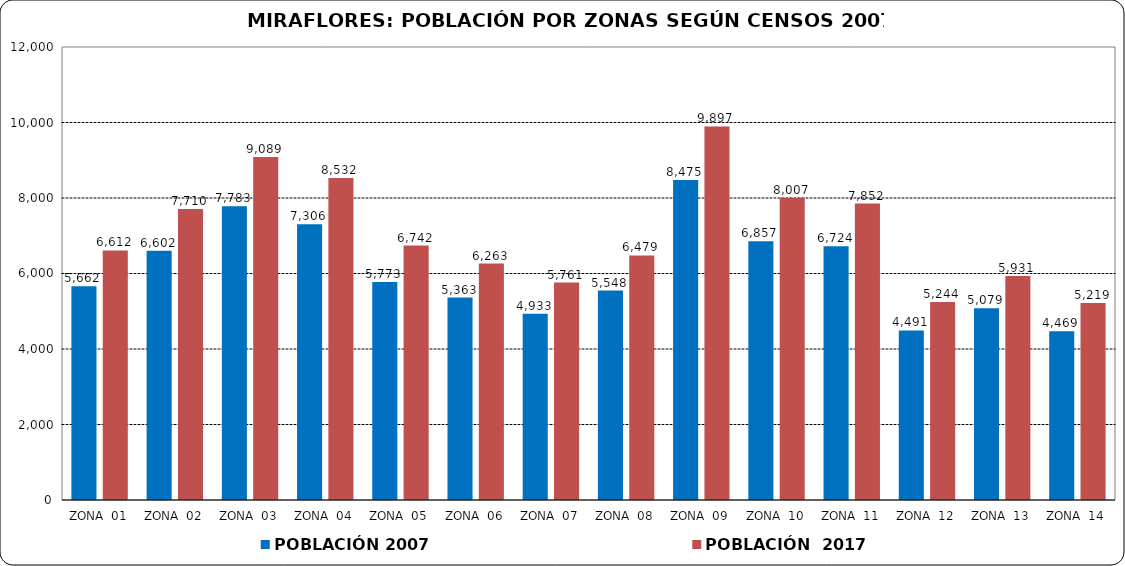
| Category | POBLACIÓN 2007 | POBLACIÓN  2017 |
|---|---|---|
| ZONA  01 | 5662 | 6611.957 |
| ZONA  02 | 6602 | 7709.668 |
| ZONA  03 | 7783 | 9088.813 |
| ZONA  04 | 7306 | 8531.783 |
| ZONA  05 | 5773 | 6741.58 |
| ZONA  06 | 5363 | 6262.791 |
| ZONA  07 | 4933 | 5760.647 |
| ZONA  08 | 5548 | 6478.83 |
| ZONA  09 | 8475 | 9896.915 |
| ZONA  10 | 6857 | 8007.451 |
| ZONA  11 | 6724 | 7852.136 |
| ZONA  12 | 4491 | 5244.489 |
| ZONA  13 | 5079 | 5931.142 |
| ZONA  14 | 4469 | 5218.798 |